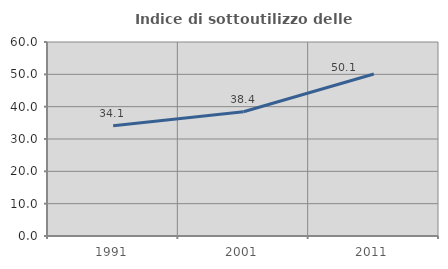
| Category | Indice di sottoutilizzo delle abitazioni  |
|---|---|
| 1991.0 | 34.096 |
| 2001.0 | 38.446 |
| 2011.0 | 50.096 |